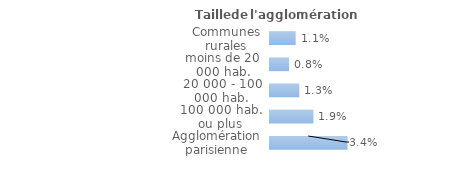
| Category | Series 0 |
|---|---|
| Communes rurales | 0.011 |
| moins de 20 000 hab. | 0.008 |
| 20 000 - 100 000 hab. | 0.013 |
| 100 000 hab. ou plus | 0.019 |
| Agglomération parisienne | 0.034 |